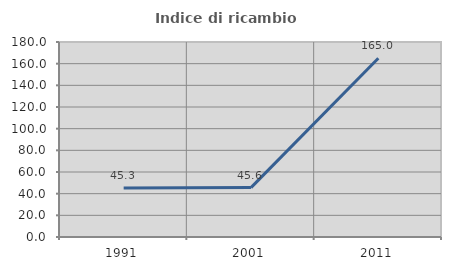
| Category | Indice di ricambio occupazionale  |
|---|---|
| 1991.0 | 45.27 |
| 2001.0 | 45.588 |
| 2011.0 | 165 |